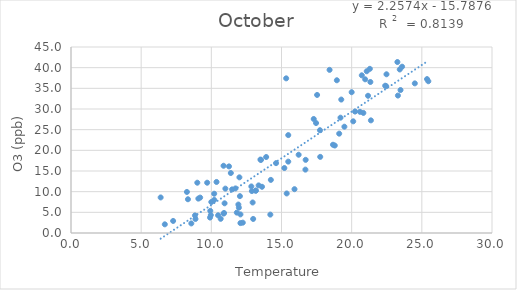
| Category | Series 0 |
|---|---|
| 11.38888888888889 | 14.508 |
| 10.870370370370388 | 16.267 |
| 9.70370370370372 | 12.167 |
| 9.000000000000002 | 12.167 |
| 8.259259259259279 | 9.933 |
| 9.203703703703722 | 8.567 |
| 8.333333333333334 | 8.167 |
| 6.388888888888889 | 8.6 |
| 9.074074074074057 | 8.317 |
| 10.37037037037039 | 12.35 |
| 13.499999999999998 | 17.767 |
| 17.296296296296276 | 27.583 |
| 20.0 | 34.067 |
| 21.29629629629628 | 39.717 |
| 23.25925925925928 | 41.367 |
| 23.59259259259261 | 40.233 |
| 23.425925925925945 | 39.567 |
| 22.4814814814815 | 38.4 |
| 21.074074074074055 | 39.133 |
| 18.425925925925945 | 39.467 |
| 17.537037037037056 | 33.4 |
| 16.222222222222225 | 18.933 |
| 15.925925925925945 | 10.6 |
| 15.37037037037039 | 9.567 |
| 12.851851851851832 | 11.267 |
| 11.722222222222223 | 10.783 |
| 10.203703703703724 | 8 |
| 9.925925925925947 | 5.35 |
| 8.833333333333332 | 4.25 |
| 8.870370370370388 | 3.4 |
| 6.685185185185168 | 2.1 |
| 7.277777777777779 | 2.917 |
| 10.481481481481502 | 4.283 |
| 13.16666666666667 | 10.25 |
| 15.481481481481502 | 17.267 |
| 18.666666666666664 | 21.35 |
| 21.370370370370388 | 27.25 |
| 23.296296296296276 | 33.25 |
| 24.499999999999996 | 36.2 |
| 25.37037037037039 | 37.233 |
| 25.462962962962944 | 36.717 |
| 23.4814814814815 | 34.583 |
| 21.166666666666664 | 33.2 |
| 19.481481481481502 | 25.717 |
| 17.759259259259277 | 18.417 |
| 15.203703703703724 | 15.717 |
| 14.240740740740721 | 12.85 |
| 13.611111111111112 | 11.183 |
| 13.370370370370388 | 11.517 |
| 12.888888888888891 | 10.15 |
| 11.4814814814815 | 10.55 |
| 11.962962962962946 | 6.133 |
| 12.074074074074055 | 4.5 |
| 11.814814814814834 | 4.933 |
| 12.074074074074055 | 2.4 |
| 12.240740740740724 | 2.5 |
| 12.981481481481502 | 3.4 |
| 14.203703703703722 | 4.45 |
| 16.703703703703724 | 15.333 |
| 18.79629629629628 | 21.167 |
| 19.111111111111114 | 24.033 |
| 20.111111111111114 | 27.017 |
| 20.833333333333336 | 29.05 |
| 20.592592592592617 | 29.317 |
| 20.24074074074072 | 29.383 |
| 19.203703703703727 | 27.9 |
| 17.740740740740723 | 24.867 |
| 16.722222222222225 | 17.7 |
| 15.481481481481502 | 23.683 |
| 13.90740740740739 | 18.383 |
| 13.16666666666667 | 10.25 |
| 12.944444444444443 | 7.383 |
| 12.037037037037056 | 8.917 |
| 13.537037037037058 | 17.683 |
| 11.259259259259279 | 16.117 |
| 10.203703703703724 | 9.5 |
| 10.944444444444446 | 7.183 |
| 10.870370370370388 | 4.7 |
| 9.907407407407389 | 3.733 |
| 8.574074074074057 | 2.317 |
| 10.666666666666668 | 3.433 |
| 11.925925925925943 | 6.883 |
| 14.61111111111111 | 16.9 |
| 17.462962962962948 | 26.6 |
| 19.259259259259277 | 32.283 |
| 20.72222222222222 | 38.15 |
| 20.962962962962948 | 37.183 |
| 22.38888888888889 | 35.633 |
| 22.462962962962944 | 35.517 |
| 21.333333333333336 | 36.533 |
| 18.944444444444443 | 36.95 |
| 15.333333333333334 | 37.417 |
| 12.000000000000002 | 13.467 |
| 10.999999999999998 | 10.733 |
| 10.907407407407387 | 4.833 |
| 9.962962962962946 | 4.333 |
| 10.0 | 7.5 |